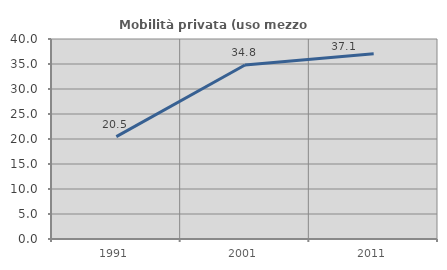
| Category | Mobilità privata (uso mezzo privato) |
|---|---|
| 1991.0 | 20.465 |
| 2001.0 | 34.81 |
| 2011.0 | 37.061 |